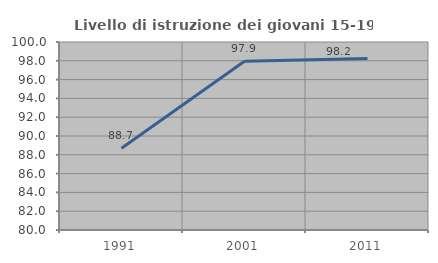
| Category | Livello di istruzione dei giovani 15-19 anni |
|---|---|
| 1991.0 | 88.705 |
| 2001.0 | 97.942 |
| 2011.0 | 98.232 |